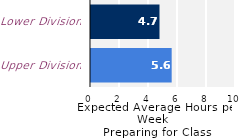
| Category | Series 0 |
|---|---|
| Upper Division | 5.564 |
| Lower Division | 4.724 |